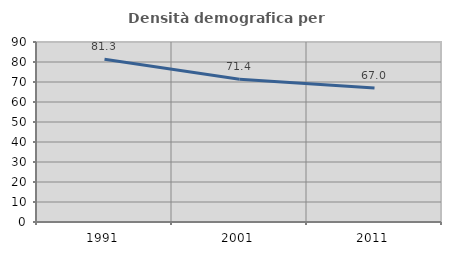
| Category | Densità demografica |
|---|---|
| 1991.0 | 81.328 |
| 2001.0 | 71.417 |
| 2011.0 | 67.012 |